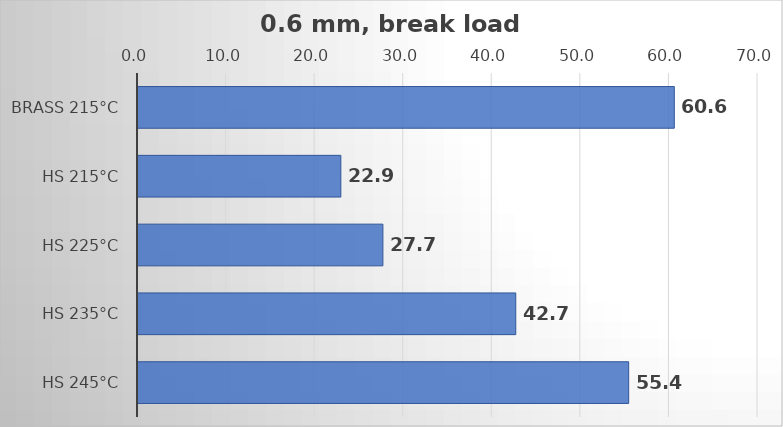
| Category | Average |
|---|---|
| Brass 215°C | 60.55 |
| HS 215°C | 22.9 |
| HS 225°C | 27.65 |
| HS 235°C | 42.65 |
| HS 245°C | 55.4 |